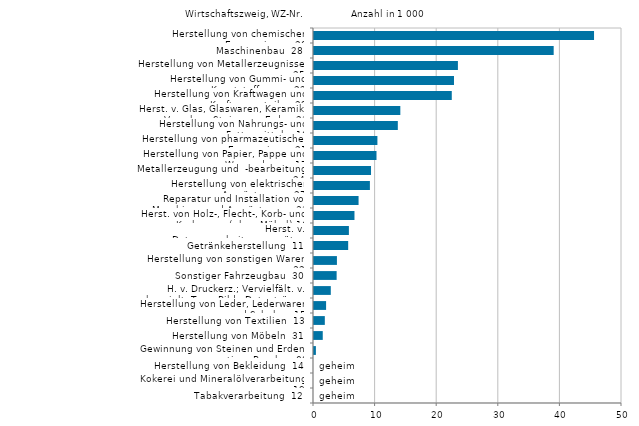
| Category | Series 0 |
|---|---|
| Herstellung von chemischen Erzeugnissen  20 | 45.461 |
| Maschinenbau  28 | 38.908 |
| Herstellung von Metallerzeugnissen  25 | 23.361 |
| Herstellung von Gummi- und Kunststoffwaren  22 | 22.725 |
| Herstellung von Kraftwagen und Kraftwagenteilen 29 | 22.365 |
| Herst. v. Glas, Glaswaren, Keramik, Verarb. v. Steinen u. Erden 23 | 14.014 |
| Herstellung von Nahrungs- und Futtermitteln  10 | 13.606 |
| Herstellung von pharmazeutischen Erzeugnissen 21 | 10.293 |
| Herstellung von Papier, Pappe und Waren daraus 17 | 10.145 |
| Metallerzeugung und  -bearbeitung  24 | 9.257 |
| Herstellung von elektrischen Ausrüstungen  27 | 9.074 |
| Reparatur und Installation von Maschinen und Ausrüstungen 33 | 7.235 |
| Herst. von Holz-, Flecht-, Korb- und Korkwaren (ohne Möbel) 16 | 6.57 |
| Herst. v. Datenverarbeitungsgeräten, elektron. u. opt. Erzeug. 26 | 5.664 |
| Getränkeherstellung  11 | 5.549 |
| Herstellung von sonstigen Waren  32 | 3.721 |
| Sonstiger Fahrzeugbau  30 | 3.674 |
| H. v. Druckerz.; Vervielfält. v. bespielt. Ton-, Bild-, Datenträgern 18 | 2.726 |
| Herstellung von Leder, Lederwaren und Schuhen 15 | 1.963 |
| Herstellung von Textilien  13 | 1.756 |
| Herstellung von Möbeln  31 | 1.421 |
| Gewinnung von Steinen und Erden, sonstiger Bergbau 08 | 0.307 |
| Herstellung von Bekleidung  14 | 0 |
| Kokerei und Mineralölverarbeitung  19 | 0 |
| Tabakverarbeitung  12 | 0 |